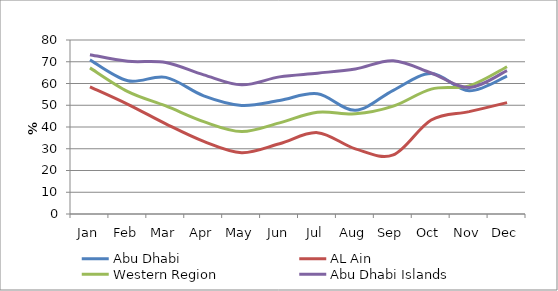
| Category | Abu Dhabi | AL Ain | Western Region | Abu Dhabi Islands |
|---|---|---|---|---|
| Jan | 70.863 | 58.452 | 67.18 | 73.264 |
| Feb | 61.246 | 50.435 | 56.271 | 70.194 |
| Mar | 62.815 | 41.458 | 49.679 | 69.658 |
| Apr | 54.308 | 33.391 | 42.458 | 63.973 |
| May | 49.928 | 28.197 | 37.918 | 59.391 |
| Jun | 52.19 | 32.318 | 41.917 | 63.053 |
| Jul | 55.26 | 37.402 | 46.78 | 64.752 |
| Aug | 47.652 | 29.958 | 46.04 | 66.696 |
| Sep | 56.875 | 27.174 | 49.578 | 70.482 |
| Oct | 64.55 | 43.236 | 57.429 | 64.825 |
| Nov | 56.64 | 47.058 | 58.934 | 58.145 |
| Dec | 63.387 | 51.189 | 67.714 | 65.94 |